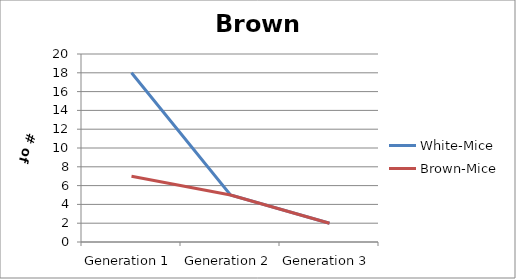
| Category | White-Mice | Brown-Mice |
|---|---|---|
| Generation 1 | 18 | 7 |
| Generation 2 | 5 | 5 |
| Generation 3 | 2 | 2 |